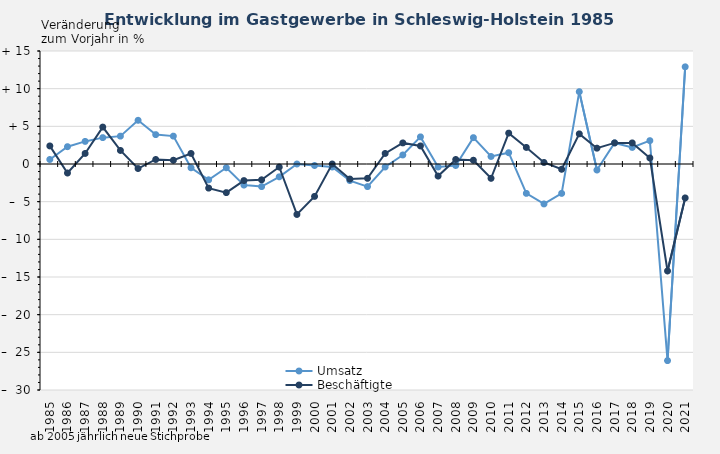
| Category | Umsatz | Beschäftigte |
|---|---|---|
| 1985.0 | 0.6 | 2.4 |
| 1986.0 | 2.3 | -1.2 |
| 1987.0 | 3 | 1.4 |
| 1988.0 | 3.5 | 4.9 |
| 1989.0 | 3.7 | 1.8 |
| 1990.0 | 5.8 | -0.6 |
| 1991.0 | 3.9 | 0.6 |
| 1992.0 | 3.7 | 0.5 |
| 1993.0 | -0.5 | 1.4 |
| 1994.0 | -2.1 | -3.2 |
| 1995.0 | -0.5 | -3.8 |
| 1996.0 | -2.8 | -2.2 |
| 1997.0 | -3 | -2.1 |
| 1998.0 | -1.7 | -0.4 |
| 1999.0 | 0 | -6.7 |
| 2000.0 | -0.2 | -4.3 |
| 2001.0 | -0.4 | 0 |
| 2002.0 | -2.2 | -2 |
| 2003.0 | -3 | -1.9 |
| 2004.0 | -0.4 | 1.4 |
| 2005.0 | 1.2 | 2.8 |
| 2006.0 | 3.6 | 2.4 |
| 2007.0 | -0.4 | -1.6 |
| 2008.0 | -0.2 | 0.6 |
| 2009.0 | 3.5 | 0.5 |
| 2010.0 | 1 | -1.9 |
| 2011.0 | 1.5 | 4.1 |
| 2012.0 | -3.9 | 2.2 |
| 2013.0 | -5.3 | 0.2 |
| 2014.0 | -3.9 | -0.7 |
| 2015.0 | 9.6 | 4 |
| 2016.0 | -0.8 | 2.1 |
| 2017.0 | 2.8 | 2.8 |
| 2018.0 | 2.2 | 2.8 |
| 2019.0 | 3.1 | 0.8 |
| 2020.0 | -26.1 | -14.2 |
| 2021.0 | 12.9 | -4.5 |